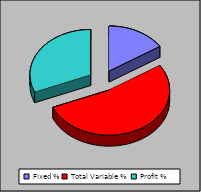
| Category | Series 0 |
|---|---|
| Fixed % | 0.158 |
| Total Variable % | 0.53 |
| Profit % | 0.312 |